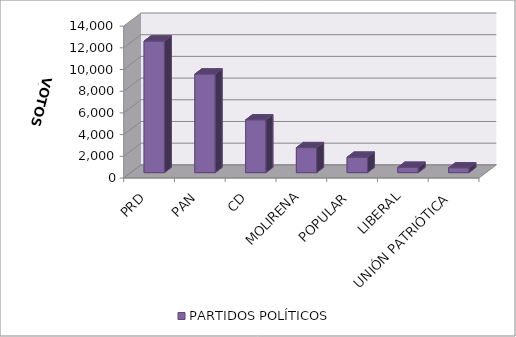
| Category | PARTIDOS POLÍTICOS |
|---|---|
| PRD | 12132 |
| PAN | 9090 |
| CD | 4866 |
| MOLIRENA | 2304 |
| POPULAR | 1422 |
| LIBERAL | 491 |
| UNIÓN PATRIÓTICA | 446 |